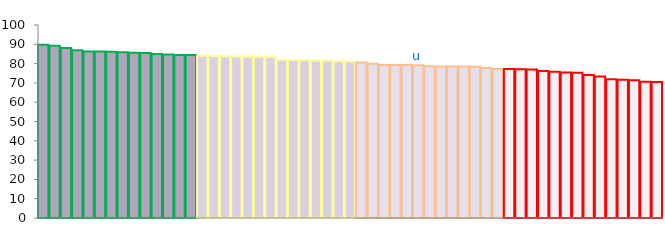
| Category | Top Quartile | 2nd Quartile | 3rd Quartile | Bottom Quartile | Series 4 |
|---|---|---|---|---|---|
|  | 89.743 | 0 | 0 | 0 | 89.743 |
|  | 89.284 | 0 | 0 | 0 | 89.284 |
|  | 88.075 | 0 | 0 | 0 | 88.075 |
|  | 86.967 | 0 | 0 | 0 | 86.967 |
|  | 86.265 | 0 | 0 | 0 | 86.265 |
|  | 86.26 | 0 | 0 | 0 | 86.26 |
|  | 86.169 | 0 | 0 | 0 | 86.169 |
|  | 85.827 | 0 | 0 | 0 | 85.827 |
|  | 85.59 | 0 | 0 | 0 | 85.59 |
|  | 85.48 | 0 | 0 | 0 | 85.48 |
|  | 84.941 | 0 | 0 | 0 | 84.941 |
|  | 84.749 | 0 | 0 | 0 | 84.749 |
|  | 84.463 | 0 | 0 | 0 | 84.463 |
|  | 84.395 | 0 | 0 | 0 | 84.395 |
|  | 0 | 84.047 | 0 | 0 | 84.047 |
|  | 0 | 83.969 | 0 | 0 | 83.969 |
|  | 0 | 83.834 | 0 | 0 | 83.834 |
|  | 0 | 83.722 | 0 | 0 | 83.722 |
|  | 0 | 83.678 | 0 | 0 | 83.678 |
|  | 0 | 83.565 | 0 | 0 | 83.565 |
|  | 0 | 83.376 | 0 | 0 | 83.376 |
|  | 0 | 81.983 | 0 | 0 | 81.983 |
|  | 0 | 81.902 | 0 | 0 | 81.902 |
|  | 0 | 81.746 | 0 | 0 | 81.746 |
|  | 0 | 81.614 | 0 | 0 | 81.614 |
|  | 0 | 81.612 | 0 | 0 | 81.612 |
|  | 0 | 81.263 | 0 | 0 | 81.263 |
|  | 0 | 81.03 | 0 | 0 | 81.03 |
|  | 0 | 0 | 80.543 | 0 | 80.543 |
|  | 0 | 0 | 79.906 | 0 | 79.906 |
|  | 0 | 0 | 79.332 | 0 | 79.332 |
|  | 0 | 0 | 79.3 | 0 | 79.3 |
|  | 0 | 0 | 79.214 | 0 | 79.214 |
| u | 0 | 0 | 79.173 | 0 | 79.173 |